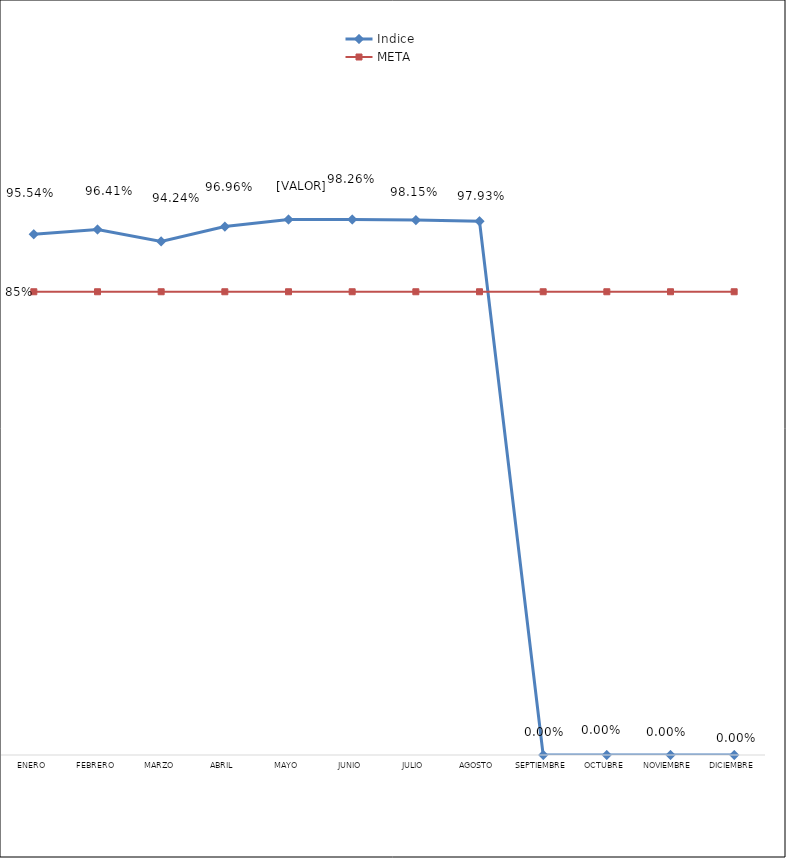
| Category | Indice | META |
|---|---|---|
| Enero | 0.955 | 0.85 |
| Febrero | 0.964 | 0.85 |
| Marzo | 0.942 | 0.85 |
| Abril | 0.97 | 0.85 |
| Mayo | 0.983 | 0.85 |
| Junio | 0.983 | 0.85 |
| Julio | 0.982 | 0.85 |
| Agosto | 0.979 | 0.85 |
| Septiembre | 0 | 0.85 |
| Octubre | 0 | 0.85 |
| Noviembre | 0 | 0.85 |
| Diciembre | 0 | 0.85 |